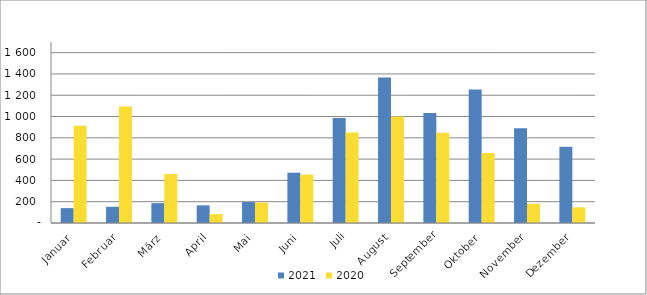
| Category | 2021 | 2020 |
|---|---|---|
| Januar | 139890 | 914276 |
| Februar | 152426 | 1093332 |
| März | 186676 | 459653 |
| April | 165722 | 83224 |
| Mai | 196711 | 191489 |
| Juni | 472381 | 454669 |
| Juli | 985615 | 850076 |
| August | 1365942 | 999664 |
| September | 1033929 | 847725 |
| Oktober | 1253815 | 656323 |
| November | 889861 | 181089 |
| Dezember | 716232 | 147093 |